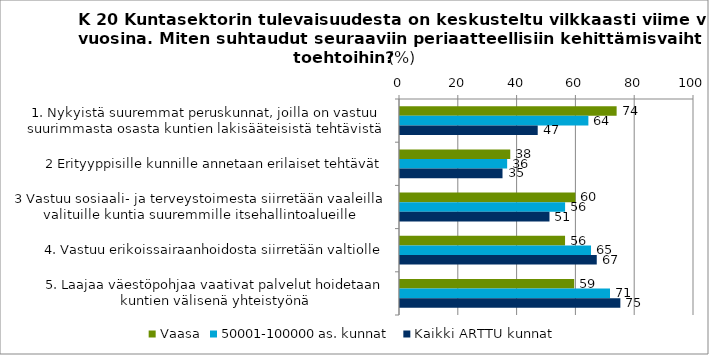
| Category | Vaasa | 50001-100000 as. kunnat | Kaikki ARTTU kunnat |
|---|---|---|---|
| 1. Nykyistä suuremmat peruskunnat, joilla on vastuu suurimmasta osasta kuntien lakisääteisistä tehtävistä | 73.684 | 64.072 | 46.843 |
| 2 Erityyppisille kunnille annetaan erilaiset tehtävät | 37.5 | 36.446 | 34.867 |
| 3 Vastuu sosiaali- ja terveystoimesta siirretään vaaleilla valituille kuntia suuremmille itsehallintoalueille | 59.649 | 56.156 | 50.845 |
| 4. Vastuu erikoissairaanhoidosta siirretään valtiolle | 56.14 | 64.97 | 66.925 |
| 5. Laajaa väestöpohjaa vaativat palvelut hoidetaan kuntien välisenä yhteistyönä | 59.259 | 71.429 | 74.951 |